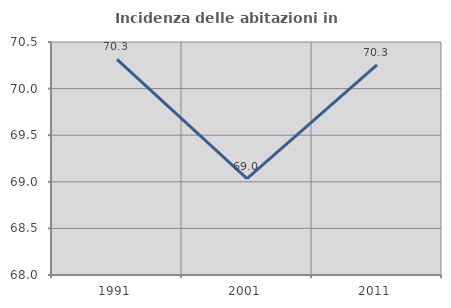
| Category | Incidenza delle abitazioni in proprietà  |
|---|---|
| 1991.0 | 70.313 |
| 2001.0 | 69.034 |
| 2011.0 | 70.256 |